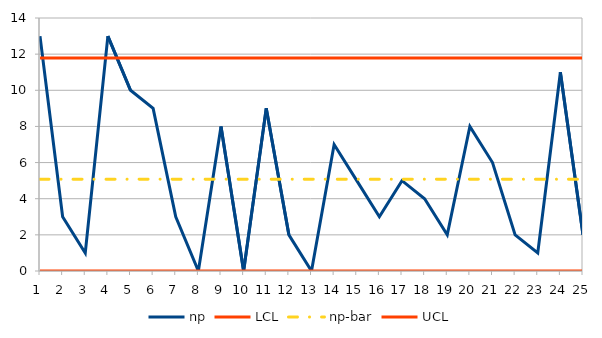
| Category | np | LCL | np-bar | UCL |
|---|---|---|---|---|
| 0 | 13 | 0 | 5.08 | 11.784 |
| 1 | 3 | 0 | 5.08 | 11.784 |
| 2 | 1 | 0 | 5.08 | 11.784 |
| 3 | 13 | 0 | 5.08 | 11.784 |
| 4 | 10 | 0 | 5.08 | 11.784 |
| 5 | 9 | 0 | 5.08 | 11.784 |
| 6 | 3 | 0 | 5.08 | 11.784 |
| 7 | 0 | 0 | 5.08 | 11.784 |
| 8 | 8 | 0 | 5.08 | 11.784 |
| 9 | 0 | 0 | 5.08 | 11.784 |
| 10 | 9 | 0 | 5.08 | 11.784 |
| 11 | 2 | 0 | 5.08 | 11.784 |
| 12 | 0 | 0 | 5.08 | 11.784 |
| 13 | 7 | 0 | 5.08 | 11.784 |
| 14 | 5 | 0 | 5.08 | 11.784 |
| 15 | 3 | 0 | 5.08 | 11.784 |
| 16 | 5 | 0 | 5.08 | 11.784 |
| 17 | 4 | 0 | 5.08 | 11.784 |
| 18 | 2 | 0 | 5.08 | 11.784 |
| 19 | 8 | 0 | 5.08 | 11.784 |
| 20 | 6 | 0 | 5.08 | 11.784 |
| 21 | 2 | 0 | 5.08 | 11.784 |
| 22 | 1 | 0 | 5.08 | 11.784 |
| 23 | 11 | 0 | 5.08 | 11.784 |
| 24 | 2 | 0 | 5.08 | 11.784 |